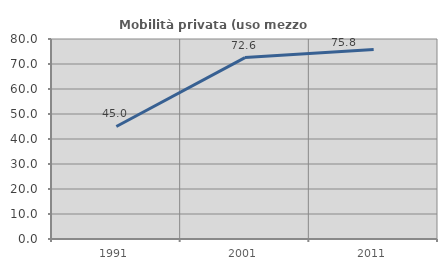
| Category | Mobilità privata (uso mezzo privato) |
|---|---|
| 1991.0 | 45.01 |
| 2001.0 | 72.569 |
| 2011.0 | 75.782 |